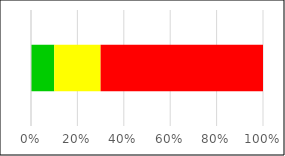
| Category | Series 0 | Series 1 | Series 2 |
|---|---|---|---|
| 0 | 0.1 | 0.2 | 0.7 |